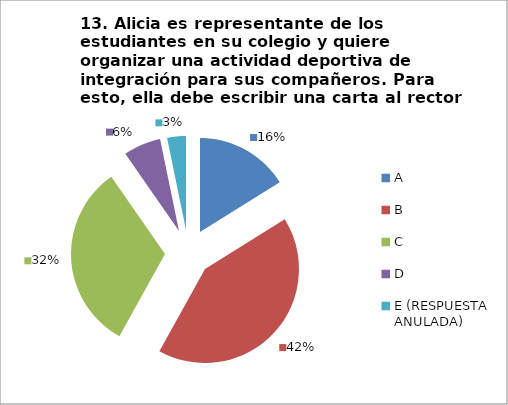
| Category | CANTIDAD DE RESPUESTAS PREGUNTA (13) | PORCENTAJE |
|---|---|---|
| A | 5 | 0.161 |
| B | 13 | 0.419 |
| C | 10 | 0.323 |
| D | 2 | 0.065 |
| E (RESPUESTA ANULADA) | 1 | 0.032 |